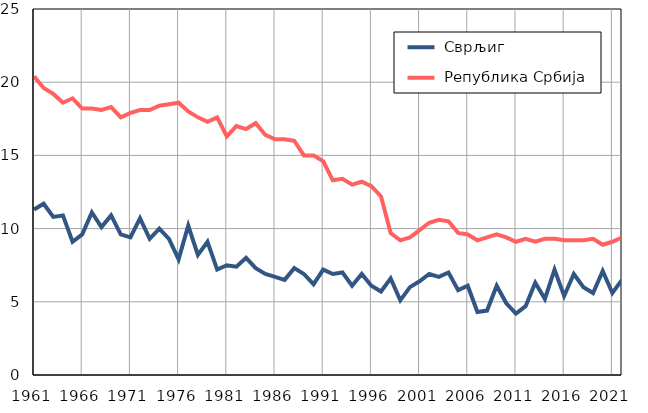
| Category |  Сврљиг |  Република Србија |
|---|---|---|
| 1961.0 | 11.3 | 20.4 |
| 1962.0 | 11.7 | 19.6 |
| 1963.0 | 10.8 | 19.2 |
| 1964.0 | 10.9 | 18.6 |
| 1965.0 | 9.1 | 18.9 |
| 1966.0 | 9.6 | 18.2 |
| 1967.0 | 11.1 | 18.2 |
| 1968.0 | 10.1 | 18.1 |
| 1969.0 | 10.9 | 18.3 |
| 1970.0 | 9.6 | 17.6 |
| 1971.0 | 9.4 | 17.9 |
| 1972.0 | 10.7 | 18.1 |
| 1973.0 | 9.3 | 18.1 |
| 1974.0 | 10 | 18.4 |
| 1975.0 | 9.3 | 18.5 |
| 1976.0 | 7.9 | 18.6 |
| 1977.0 | 10.2 | 18 |
| 1978.0 | 8.2 | 17.6 |
| 1979.0 | 9.1 | 17.3 |
| 1980.0 | 7.2 | 17.6 |
| 1981.0 | 7.5 | 16.3 |
| 1982.0 | 7.4 | 17 |
| 1983.0 | 8 | 16.8 |
| 1984.0 | 7.3 | 17.2 |
| 1985.0 | 6.9 | 16.4 |
| 1986.0 | 6.7 | 16.1 |
| 1987.0 | 6.5 | 16.1 |
| 1988.0 | 7.3 | 16 |
| 1989.0 | 6.9 | 15 |
| 1990.0 | 6.2 | 15 |
| 1991.0 | 7.2 | 14.6 |
| 1992.0 | 6.9 | 13.3 |
| 1993.0 | 7 | 13.4 |
| 1994.0 | 6.1 | 13 |
| 1995.0 | 6.9 | 13.2 |
| 1996.0 | 6.1 | 12.9 |
| 1997.0 | 5.7 | 12.2 |
| 1998.0 | 6.6 | 9.7 |
| 1999.0 | 5.1 | 9.2 |
| 2000.0 | 6 | 9.4 |
| 2001.0 | 6.4 | 9.9 |
| 2002.0 | 6.9 | 10.4 |
| 2003.0 | 6.7 | 10.6 |
| 2004.0 | 7 | 10.5 |
| 2005.0 | 5.8 | 9.7 |
| 2006.0 | 6.1 | 9.6 |
| 2007.0 | 4.3 | 9.2 |
| 2008.0 | 4.4 | 9.4 |
| 2009.0 | 6.1 | 9.6 |
| 2010.0 | 4.9 | 9.4 |
| 2011.0 | 4.2 | 9.1 |
| 2012.0 | 4.7 | 9.3 |
| 2013.0 | 6.3 | 9.1 |
| 2014.0 | 5.2 | 9.3 |
| 2015.0 | 7.2 | 9.3 |
| 2016.0 | 5.4 | 9.2 |
| 2017.0 | 6.9 | 9.2 |
| 2018.0 | 6 | 9.2 |
| 2019.0 | 5.6 | 9.3 |
| 2020.0 | 7.1 | 8.9 |
| 2021.0 | 5.6 | 9.1 |
| 2022.0 | 6.5 | 9.4 |